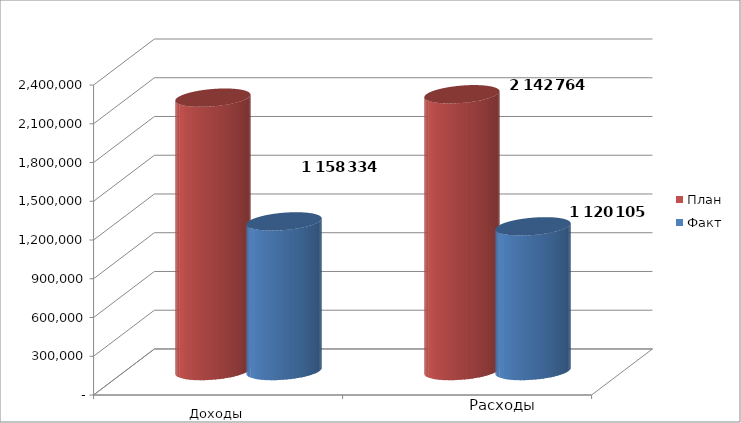
| Category | План | Факт |
|---|---|---|
| 0 | 2116359 | 1158334 |
| 1 | 2142764 | 1120104.5 |